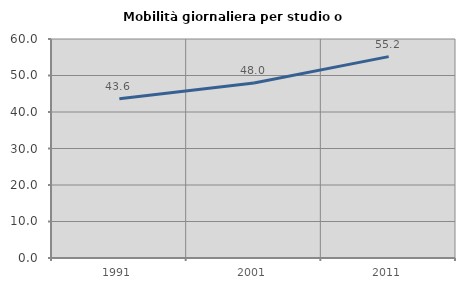
| Category | Mobilità giornaliera per studio o lavoro |
|---|---|
| 1991.0 | 43.62 |
| 2001.0 | 47.97 |
| 2011.0 | 55.166 |